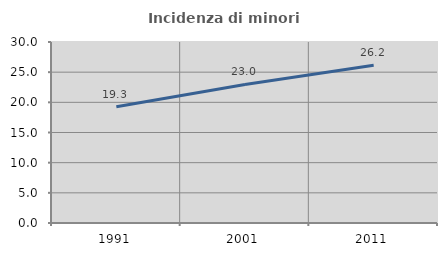
| Category | Incidenza di minori stranieri |
|---|---|
| 1991.0 | 19.259 |
| 2001.0 | 22.958 |
| 2011.0 | 26.162 |